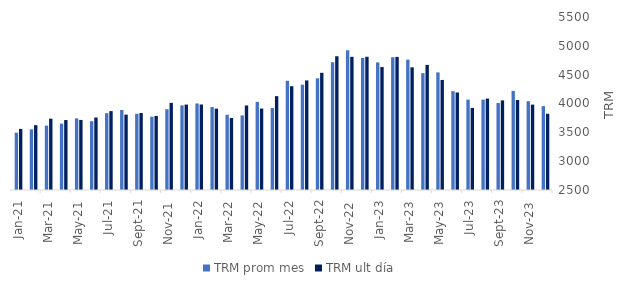
| Category | TRM prom mes | TRM ult día |
|---|---|---|
| 2021-01-01 | 3494.53 | 3559.46 |
| 2021-02-01 | 3552.43 | 3624.39 |
| 2021-03-01 | 3617 | 3736.91 |
| 2021-04-01 | 3651.85 | 3712.89 |
| 2021-05-01 | 3741.96 | 3715.28 |
| 2021-06-01 | 3693 | 3756.67 |
| 2021-07-01 | 3832.24 | 3867.88 |
| 2021-08-01 | 3887.68 | 3806.87 |
| 2021-09-01 | 3821.54 | 3834.68 |
| 2021-10-01 | 3771.68 | 3784.44 |
| 2021-11-01 | 3900.51 | 4010.98 |
| 2021-12-01 | 3967.77 | 3981.16 |
| 2022-01-01 | 4000.72 | 3982.6 |
| 2022-02-01 | 3938.36 | 3910.64 |
| 2022-03-01 | 3805.52 | 3748.15 |
| 2022-04-01 | 3792.98 | 3966.27 |
| 2022-05-01 | 4027.6 | 3912.34 |
| 2022-06-01 | 3922.5 | 4127.47 |
| 2022-07-01 | 4394.01 | 4300.3 |
| 2022-08-01 | 4326.77 | 4400.16 |
| 2022-09-01 | 4437.31 | 4532.07 |
| 2022-10-01 | 4714.96 | 4819.42 |
| 2022-11-01 | 4922.3 | 4809.51 |
| 2022-12-01 | 4787.89 | 4810.2 |
| 2023-01-01 | 4712.18 | 4632.2 |
| 2023-02-01 | 4802.75 | 4808.14 |
| 2023-03-01 | 4760.96 | 4627.27 |
| 2023-04-01 | 4526.03 | 4669 |
| 2023-05-01 | 4539.54 | 4408.65 |
| 2023-06-01 | 4213.53 | 4191.28 |
| 2023-07-01 | 4067.63 | 3923.49 |
| 2023-08-01 | 4066.87 | 4085.33 |
| 2023-09-01 | 4008.41 | 4053.76 |
| 2023-10-01 | 4219.16 | 4060.83 |
| 2023-11-01 | 4040.26 | 3980.67 |
| 2023-12-01 | 3954.14 | 3822.05 |